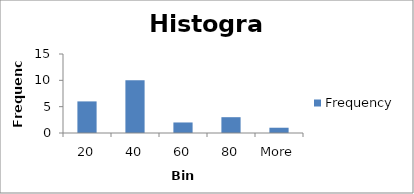
| Category | Frequency |
|---|---|
| 20 | 6 |
| 40 | 10 |
| 60 | 2 |
| 80 | 3 |
| More | 1 |